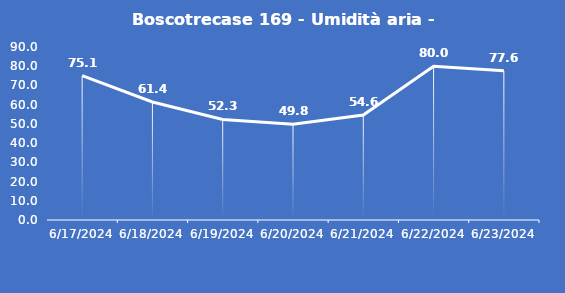
| Category | Boscotrecase 169 - Umidità aria - Grezzo (%) |
|---|---|
| 6/17/24 | 75.1 |
| 6/18/24 | 61.4 |
| 6/19/24 | 52.3 |
| 6/20/24 | 49.8 |
| 6/21/24 | 54.6 |
| 6/22/24 | 80 |
| 6/23/24 | 77.6 |